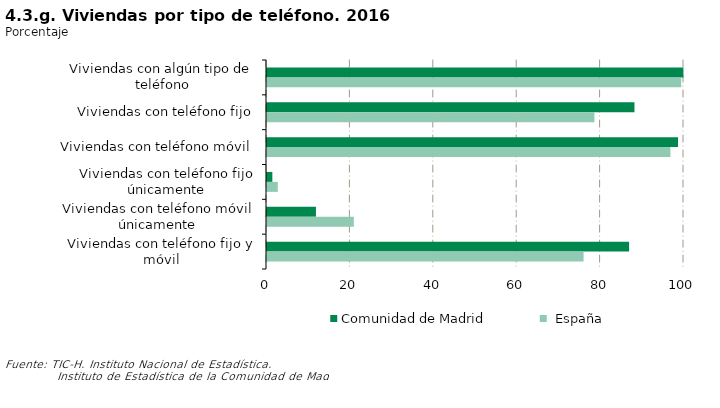
| Category | Comunidad de Madrid | España |
|---|---|---|
| Viviendas con algún tipo de teléfono | 99.854 | 99.33 |
| Viviendas con teléfono fijo | 88.118 | 78.509 |
| Viviendas con teléfono móvil | 98.573 | 96.74 |
| Viviendas con teléfono fijo únicamente | 1.281 | 2.59 |
| Viviendas con teléfono móvil únicamente | 11.736 | 20.821 |
| Viviendas con teléfono fijo y móvil | 86.837 | 75.919 |